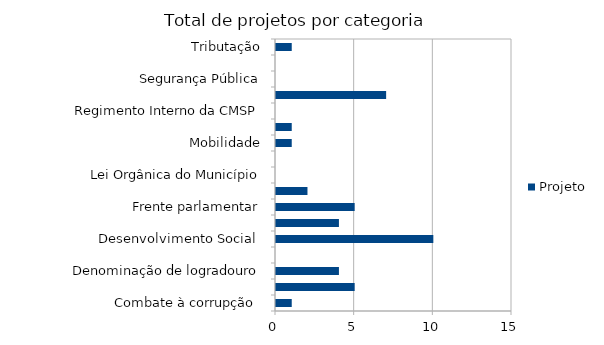
| Category | Projeto |
|---|---|
| Combate à corrupção  | 1 |
| Datas comemorativas e homenagens diversas | 5 |
| Denominação de logradouro | 4 |
| Desenvolvimento Econômico | 0 |
| Desenvolvimento Social  | 10 |
| Educação e cultura | 4 |
| Frente parlamentar | 5 |
| Habitação e Urbanismo | 2 |
| Lei Orgânica do Município | 0 |
| Meio ambiente ,  | 0 |
| Mobilidade | 1 |
| Proteção dos animais | 1 |
| Regimento Interno da CMSP | 0 |
| Saude-Esporte | 7 |
| Segurança Pública | 0 |
| Transparencia | 0 |
| Tributação | 1 |